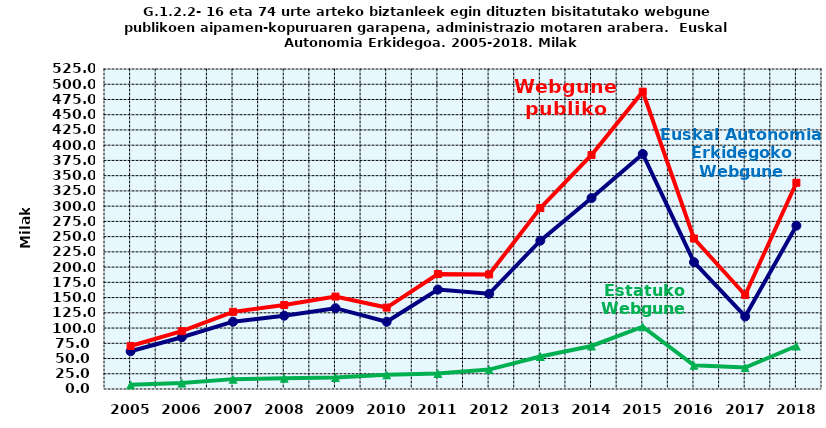
| Category | Euskal Autonomia Erkidegoko Webgune publikoak | Estatuko Webgune publikoak | Webgune publiko guztira |
|---|---|---|---|
| 2005.0 | 61.9 | 7 | 70.6 |
| 2006.0 | 84.9 | 10 | 94.9 |
| 2007.0 | 110.4 | 16.2 | 126.6 |
| 2008.0 | 120.2 | 17.6 | 137.8 |
| 2009.0 | 132.6 | 19 | 151.6 |
| 2010.0 | 110.3 | 23.3 | 133.6 |
| 2011.0 | 163.1 | 25.5 | 188.6 |
| 2012.0 | 156.2 | 31.8 | 188 |
| 2013.0 | 243.4 | 53.4 | 296.8 |
| 2014.0 | 313.3 | 70.6 | 383.9 |
| 2015.0 | 385.6 | 102.2 | 487.8 |
| 2016.0 | 208.1 | 38.8 | 246.9 |
| 2017.0 | 119 | 35.2 | 154.2 |
| 2018.0 | 267.9 | 70.5 | 338.4 |